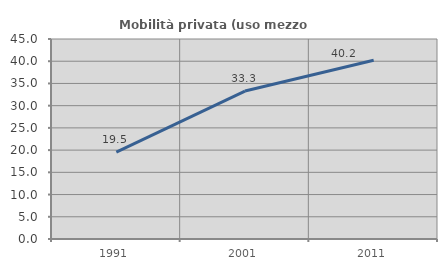
| Category | Mobilità privata (uso mezzo privato) |
|---|---|
| 1991.0 | 19.55 |
| 2001.0 | 33.287 |
| 2011.0 | 40.206 |